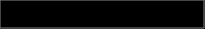
| Category | Series 0 |
|---|---|
| 0 | 0.165 |
| 1 | 0.757 |
| 2 | 0.078 |